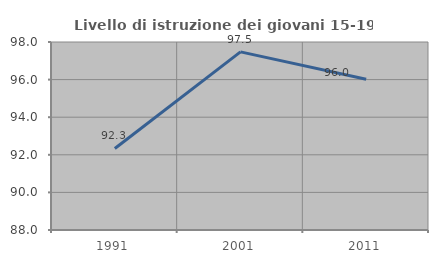
| Category | Livello di istruzione dei giovani 15-19 anni |
|---|---|
| 1991.0 | 92.336 |
| 2001.0 | 97.475 |
| 2011.0 | 96.018 |